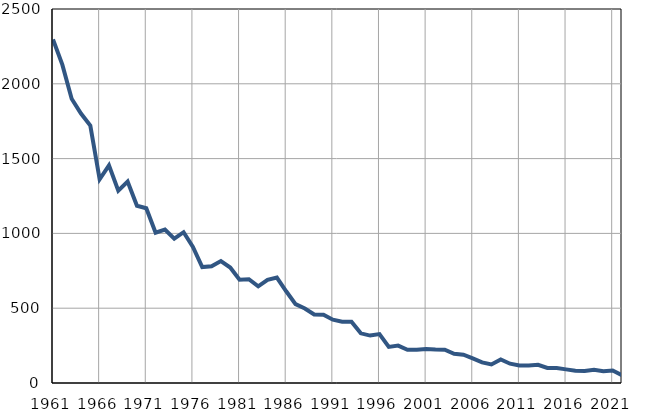
| Category | Умрла 
одојчад |
|---|---|
| 1961.0 | 2297 |
| 1962.0 | 2128 |
| 1963.0 | 1900 |
| 1964.0 | 1801 |
| 1965.0 | 1721 |
| 1966.0 | 1362 |
| 1967.0 | 1455 |
| 1968.0 | 1285 |
| 1969.0 | 1346 |
| 1970.0 | 1185 |
| 1971.0 | 1168 |
| 1972.0 | 1005 |
| 1973.0 | 1026 |
| 1974.0 | 965 |
| 1975.0 | 1008 |
| 1976.0 | 910 |
| 1977.0 | 775 |
| 1978.0 | 780 |
| 1979.0 | 815 |
| 1980.0 | 772 |
| 1981.0 | 691 |
| 1982.0 | 694 |
| 1983.0 | 646 |
| 1984.0 | 690 |
| 1985.0 | 705 |
| 1986.0 | 613 |
| 1987.0 | 527 |
| 1988.0 | 498 |
| 1989.0 | 458 |
| 1990.0 | 456 |
| 1991.0 | 423 |
| 1992.0 | 409 |
| 1993.0 | 410 |
| 1994.0 | 332 |
| 1995.0 | 317 |
| 1996.0 | 327 |
| 1997.0 | 241 |
| 1998.0 | 250 |
| 1999.0 | 222 |
| 2000.0 | 222 |
| 2001.0 | 228 |
| 2002.0 | 224 |
| 2003.0 | 222 |
| 2004.0 | 195 |
| 2005.0 | 189 |
| 2006.0 | 165 |
| 2007.0 | 138 |
| 2008.0 | 124 |
| 2009.0 | 157 |
| 2010.0 | 129 |
| 2011.0 | 117 |
| 2012.0 | 117 |
| 2013.0 | 122 |
| 2014.0 | 101 |
| 2015.0 | 100 |
| 2016.0 | 91 |
| 2017.0 | 82 |
| 2018.0 | 80 |
| 2019.0 | 89 |
| 2020.0 | 79 |
| 2021.0 | 84 |
| 2022.0 | 52 |